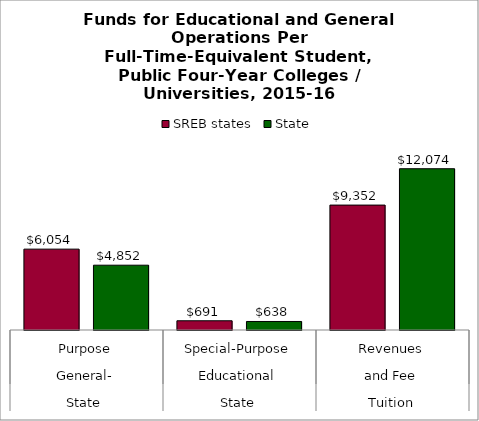
| Category | SREB states | State |
|---|---|---|
| 0 | 6053.835 | 4851.577 |
| 1 | 691.178 | 637.932 |
| 2 | 9352.012 | 12073.838 |